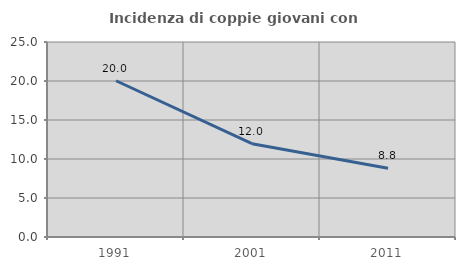
| Category | Incidenza di coppie giovani con figli |
|---|---|
| 1991.0 | 20.032 |
| 2001.0 | 11.968 |
| 2011.0 | 8.817 |